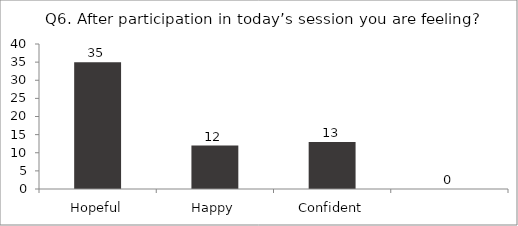
| Category | Q6. After participation in today’s session you are feeling? |
|---|---|
| Hopeful | 35 |
| Happy | 12 |
| Confident | 13 |